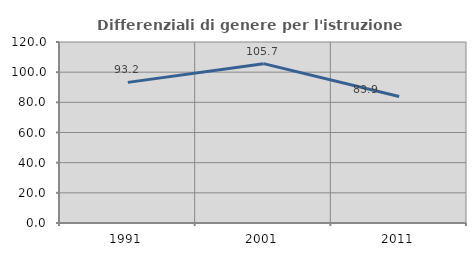
| Category | Differenziali di genere per l'istruzione superiore |
|---|---|
| 1991.0 | 93.226 |
| 2001.0 | 105.652 |
| 2011.0 | 83.852 |